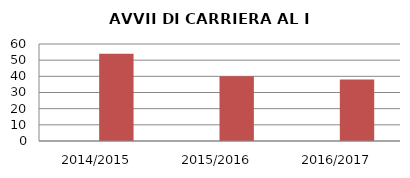
| Category | ANNO | NUMERO |
|---|---|---|
| 2014/2015 | 0 | 54 |
| 2015/2016 | 0 | 40 |
| 2016/2017 | 0 | 38 |